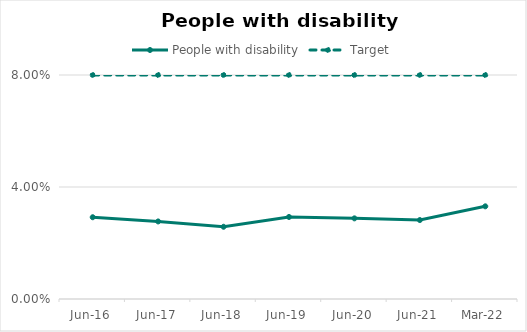
| Category | People with disability | Target |
|---|---|---|
| 2016-06-01 | 0.029 | 0.08 |
| 2017-06-01 | 0.028 | 0.08 |
| 2018-06-01 | 0.026 | 0.08 |
| 2019-06-01 | 0.029 | 0.08 |
| 2020-06-01 | 0.029 | 0.08 |
| 2021-06-01 | 0.028 | 0.08 |
| 2022-03-01 | 0.033 | 0.08 |